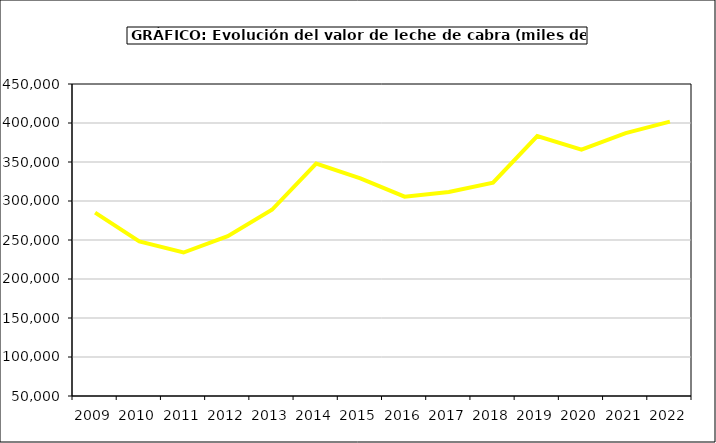
| Category | Leche de cabra |
|---|---|
| 2009.0 | 285113 |
| 2010.0 | 248183 |
| 2011.0 | 233958 |
| 2012.0 | 254951 |
| 2013.0 | 288752 |
| 2014.0 | 347969 |
| 2015.0 | 329025 |
| 2016.0 | 305547 |
| 2017.0 | 311527 |
| 2018.0 | 323450 |
| 2019.0 | 383310 |
| 2020.0 | 365968 |
| 2021.0 | 387094.92 |
| 2022.0 | 401701.414 |